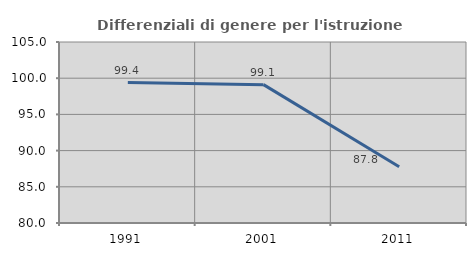
| Category | Differenziali di genere per l'istruzione superiore |
|---|---|
| 1991.0 | 99.406 |
| 2001.0 | 99.11 |
| 2011.0 | 87.779 |